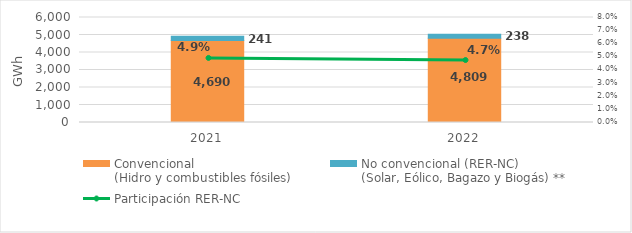
| Category | Convencional
(Hidro y combustibles fósiles) | No convencional (RER-NC)
(Solar, Eólico, Bagazo y Biogás) ** |
|---|---|---|
| 2021.0 | 4689.8 | 240.713 |
| 2022.0 | 4808.78 | 238.325 |